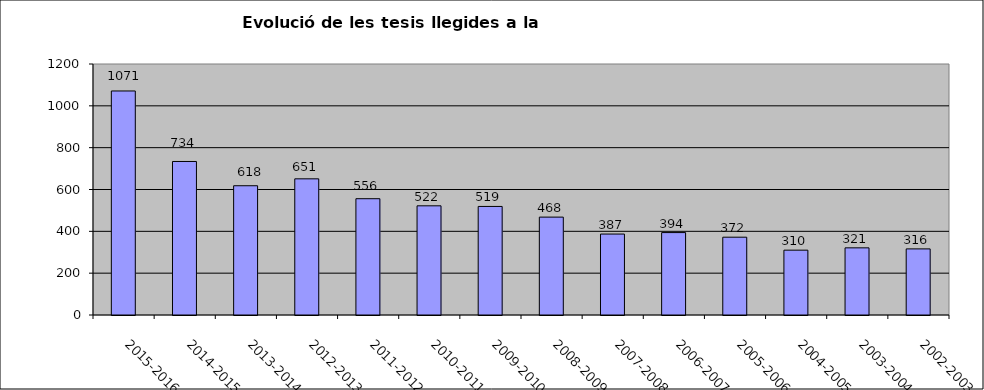
| Category | Series 0 |
|---|---|
| 2015-2016 | 1071 |
| 2014-2015 | 734 |
| 2013-2014 | 618 |
| 2012-2013 | 651 |
| 2011-2012 | 556 |
| 2010-2011 | 522 |
| 2009-2010 | 519 |
| 2008-2009 | 468 |
| 2007-2008 | 387 |
| 2006-2007 | 394 |
| 2005-2006 | 372 |
| 2004-2005 | 310 |
| 2003-2004 | 321 |
| 2002-2003 | 316 |